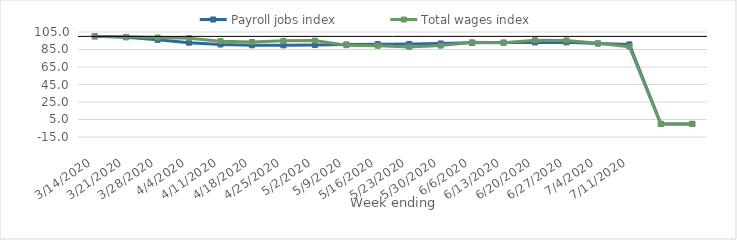
| Category | Payroll jobs index | Total wages index |
|---|---|---|
| 14/03/2020 | 100 | 100 |
| 21/03/2020 | 98.924 | 99.44 |
| 28/03/2020 | 96.037 | 98.67 |
| 04/04/2020 | 92.788 | 97.923 |
| 11/04/2020 | 90.746 | 94.523 |
| 18/04/2020 | 89.83 | 93.6 |
| 25/04/2020 | 89.765 | 94.891 |
| 02/05/2020 | 90.092 | 95.152 |
| 09/05/2020 | 90.753 | 89.955 |
| 16/05/2020 | 91.135 | 89.226 |
| 23/05/2020 | 91.39 | 87.966 |
| 30/05/2020 | 91.863 | 89.456 |
| 06/06/2020 | 92.583 | 93.2 |
| 13/06/2020 | 92.878 | 92.733 |
| 20/06/2020 | 93.073 | 95.617 |
| 27/06/2020 | 93.145 | 95.396 |
| 04/07/2020 | 91.805 | 92.065 |
| 11/07/2020 | 90.843 | 88.244 |